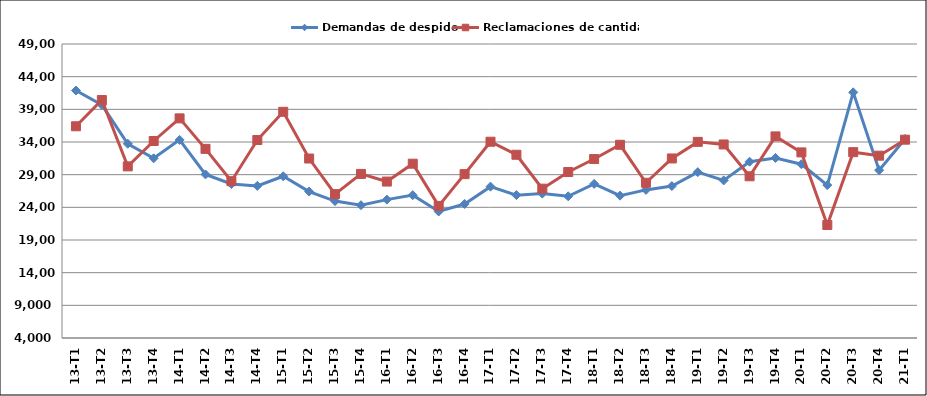
| Category | Demandas de despido | Reclamaciones de cantidad |
|---|---|---|
| 13-T1 | 41878 | 36407 |
| 13-T2 | 39682 | 40424 |
| 13-T3 | 33730 | 30268 |
| 13-T4 | 31506 | 34154 |
| 14-T1 | 34327 | 37617 |
| 14-T2 | 29037 | 32948 |
| 14-T3 | 27571 | 27999 |
| 14-T4 | 27278 | 34299 |
| 15-T1 | 28755 | 38621 |
| 15-T2 | 26417 | 31470 |
| 15-T3 | 24957 | 26018 |
| 15-T4 | 24328 | 29112 |
| 16-T1 | 25182 | 27945 |
| 16-T2 | 25866 | 30682 |
| 16-T3 | 23364 | 24220 |
| 16-T4 | 24509 | 29081 |
| 17-T1 | 27166 | 34041 |
| 17-T2 | 25869 | 32047 |
| 17-T3 | 26101 | 26854 |
| 17-T4 | 25688 | 29408 |
| 18-T1 | 27589 | 31392 |
| 18-T2 | 25785 | 33573 |
| 18-T3 | 26669 | 27761 |
| 18-T4 | 27251 | 31480 |
| 19-T1 | 29386 | 34020 |
| 19-T2 | 28121 | 33623 |
| 19-T3 | 30981 | 28752 |
| 19-T4 | 31561 | 34857 |
| 20-T1 | 30597 | 32408 |
| 20-T2 | 27401 | 21297 |
| 20-T3 | 41597 | 32446 |
| 20-T4 | 29692 | 31906 |
| 21-T1 | 34461 | 34356 |